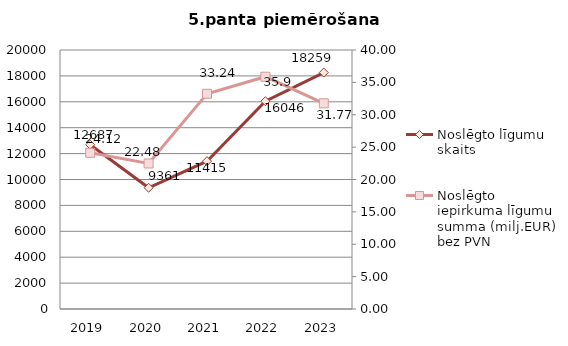
| Category | Noslēgto līgumu skaits |
|---|---|
| 2019.0 | 12687 |
| 2020.0 | 9361 |
| 2021.0 | 11415 |
| 2022.0 | 16046 |
| 2023.0 | 18259 |